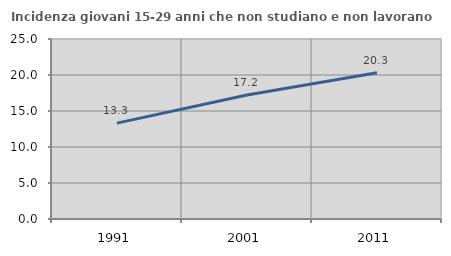
| Category | Incidenza giovani 15-29 anni che non studiano e non lavorano  |
|---|---|
| 1991.0 | 13.313 |
| 2001.0 | 17.211 |
| 2011.0 | 20.312 |